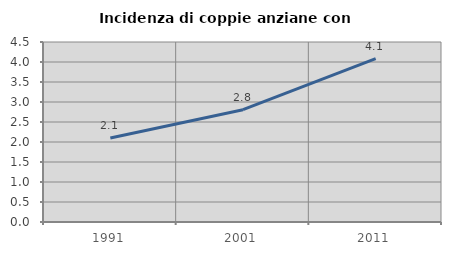
| Category | Incidenza di coppie anziane con figli |
|---|---|
| 1991.0 | 2.102 |
| 2001.0 | 2.807 |
| 2011.0 | 4.084 |